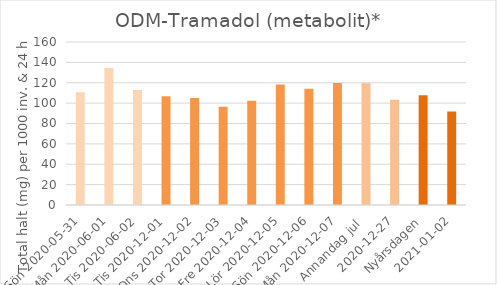
| Category | ODM-Tramadol (metabolit)* |
|---|---|
| Sön 2020-05-31 | 110.7 |
| Mån 2020-06-01 | 134.6 |
|  Tis 2020-06-02 | 113 |
| Tis 2020-12-01 | 106.8 |
| Ons 2020-12-02 | 105 |
| Tor 2020-12-03 | 96.4 |
| Fre 2020-12-04 | 102.4 |
| Lör 2020-12-05 | 118.4 |
| Sön 2020-12-06 | 114 |
| Mån 2020-12-07 | 119.7 |
| Annandag jul  | 119.6 |
| 2020-12-27 | 103.3 |
| Nyårsdagen | 107.7 |
| 2021-01-02 | 91.9 |